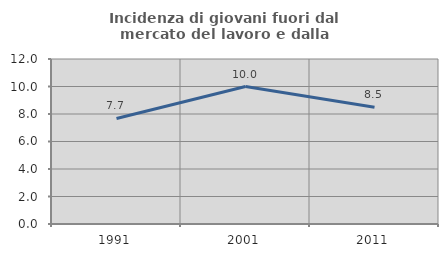
| Category | Incidenza di giovani fuori dal mercato del lavoro e dalla formazione  |
|---|---|
| 1991.0 | 7.677 |
| 2001.0 | 10 |
| 2011.0 | 8.486 |